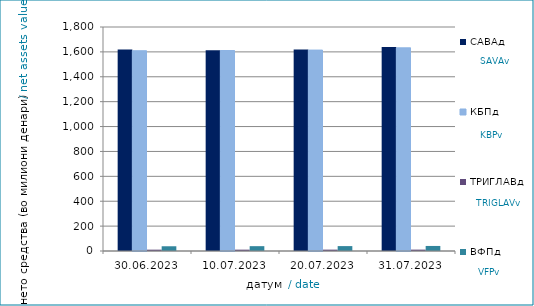
| Category | САВАд | КБПд | ТРИГЛАВд | ВФПд |
|---|---|---|---|---|
| 2023-06-30 | 1619.723 | 1609.202 | 10.774 | 38.084 |
| 2023-07-10 | 1613.275 | 1610.894 | 10.833 | 38.881 |
| 2023-07-20 | 1618.234 | 1614.5 | 10.955 | 39.408 |
| 2023-07-31 | 1638.462 | 1632.598 | 11.06 | 40.517 |